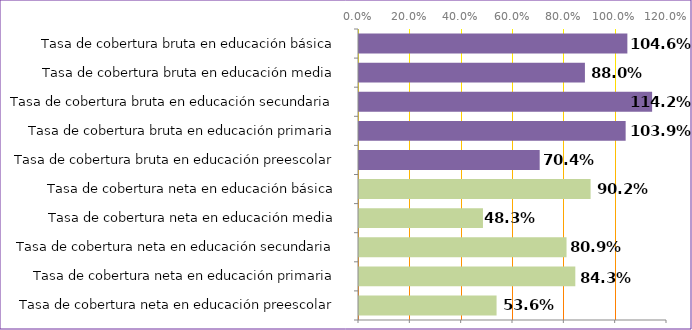
| Category | Series 0 |
|---|---|
| Tasa de cobertura neta en educación preescolar | 0.536 |
| Tasa de cobertura neta en educación primaria | 0.843 |
| Tasa de cobertura neta en educación secundaria | 0.809 |
| Tasa de cobertura neta en educación media | 0.483 |
| Tasa de cobertura neta en educación básica | 0.902 |
| Tasa de cobertura bruta en educación preescolar | 0.704 |
| Tasa de cobertura bruta en educación primaria | 1.039 |
| Tasa de cobertura bruta en educación secundaria | 1.142 |
| Tasa de cobertura bruta en educación media | 0.88 |
| Tasa de cobertura bruta en educación básica | 1.046 |